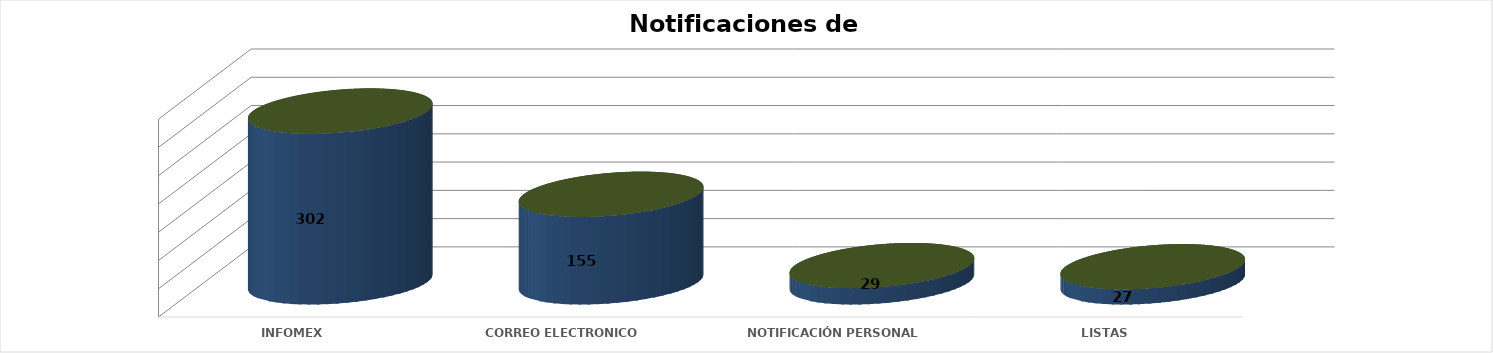
| Category | Series 0 | Series 1 | Series 2 | Series 3 | Series 4 |
|---|---|---|---|---|---|
| INFOMEX |  |  |  | 302 | 0.589 |
| CORREO ELECTRONICO |  |  |  | 155 | 0.302 |
| NOTIFICACIÓN PERSONAL |  |  |  | 29 | 0.057 |
| LISTAS |  |  |  | 27 | 0.053 |